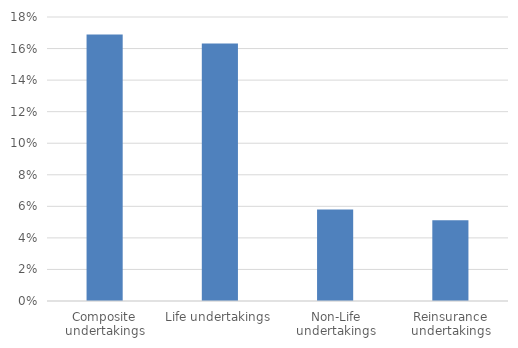
| Category | Series 0 |
|---|---|
| Composite undertakings | 0.169 |
| Life undertakings | 0.163 |
| Non-Life undertakings | 0.058 |
| Reinsurance undertakings | 0.051 |